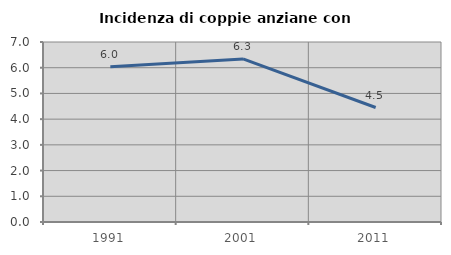
| Category | Incidenza di coppie anziane con figli |
|---|---|
| 1991.0 | 6.034 |
| 2001.0 | 6.343 |
| 2011.0 | 4.452 |